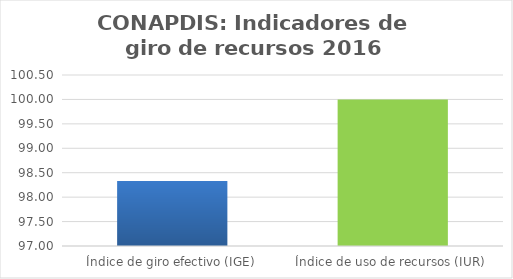
| Category | Series 0 |
|---|---|
| Índice de giro efectivo (IGE) | 98.331 |
| Índice de uso de recursos (IUR)  | 100 |